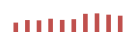
| Category | Importações (2) |
|---|---|
| 2007.0 | 62681.056 |
| 2008.0 | 79621.593 |
| 2009.0 | 77709.867 |
| 2010.0 | 88593.929 |
| 2011.0 | 80744.22 |